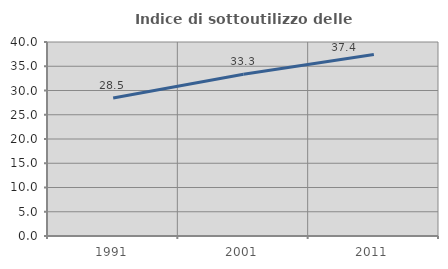
| Category | Indice di sottoutilizzo delle abitazioni  |
|---|---|
| 1991.0 | 28.472 |
| 2001.0 | 33.333 |
| 2011.0 | 37.443 |